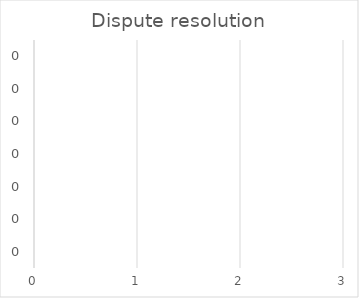
| Category | Dispute resolution |
|---|---|
| 0.0 | 0 |
| 0.0 | 0 |
| 0.0 | 0 |
| 0.0 | 0 |
| 0.0 | 0 |
| 0.0 | 0 |
| 0.0 | 0 |